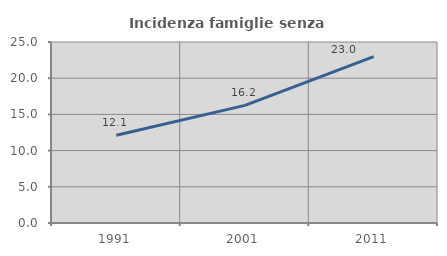
| Category | Incidenza famiglie senza nuclei |
|---|---|
| 1991.0 | 12.127 |
| 2001.0 | 16.242 |
| 2011.0 | 22.978 |